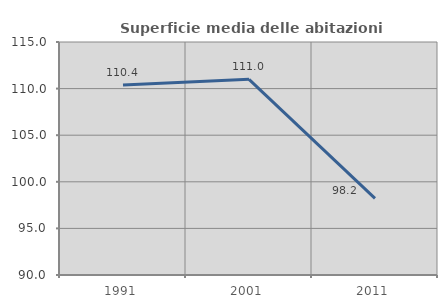
| Category | Superficie media delle abitazioni occupate |
|---|---|
| 1991.0 | 110.388 |
| 2001.0 | 110.995 |
| 2011.0 | 98.214 |